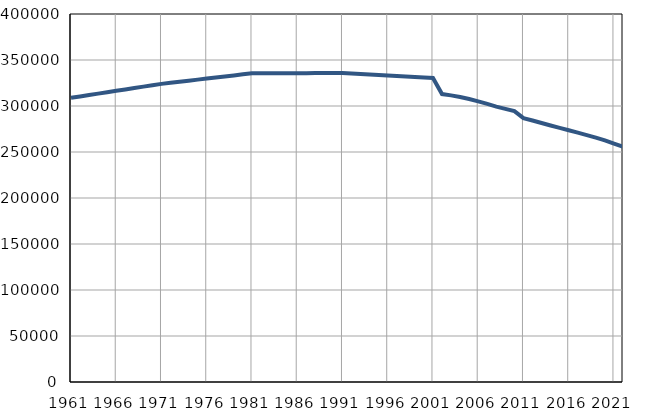
| Category | Број
становника |
|---|---|
| 1961.0 | 308918 |
| 1962.0 | 310433 |
| 1963.0 | 311947 |
| 1964.0 | 313462 |
| 1965.0 | 314977 |
| 1966.0 | 316492 |
| 1967.0 | 318006 |
| 1968.0 | 319521 |
| 1969.0 | 321036 |
| 1970.0 | 322550 |
| 1971.0 | 324065 |
| 1972.0 | 325216 |
| 1973.0 | 326366 |
| 1974.0 | 327517 |
| 1975.0 | 328667 |
| 1976.0 | 329818 |
| 1977.0 | 330968 |
| 1978.0 | 332119 |
| 1979.0 | 333269 |
| 1980.0 | 334420 |
| 1981.0 | 335570 |
| 1982.0 | 335596 |
| 1983.0 | 335621 |
| 1984.0 | 335647 |
| 1985.0 | 335672 |
| 1986.0 | 335698 |
| 1987.0 | 335724 |
| 1988.0 | 335749 |
| 1989.0 | 335775 |
| 1990.0 | 335800 |
| 1991.0 | 335826 |
| 1992.0 | 335295 |
| 1993.0 | 334764 |
| 1994.0 | 334233 |
| 1995.0 | 333702 |
| 1996.0 | 333171 |
| 1997.0 | 332641 |
| 1998.0 | 332110 |
| 1999.0 | 331579 |
| 2000.0 | 331048 |
| 2001.0 | 330517 |
| 2002.0 | 313000 |
| 2003.0 | 311572 |
| 2004.0 | 309856 |
| 2005.0 | 307622 |
| 2006.0 | 305072 |
| 2007.0 | 302228 |
| 2008.0 | 299360 |
| 2009.0 | 296858 |
| 2010.0 | 294400 |
| 2011.0 | 286825 |
| 2012.0 | 284216 |
| 2013.0 | 281475 |
| 2014.0 | 278771 |
| 2015.0 | 276210 |
| 2016.0 | 273629 |
| 2017.0 | 271080 |
| 2018.0 | 268393 |
| 2019.0 | 265638 |
| 2020.0 | 262664 |
| 2021.0 | 259182 |
| 2022.0 | 255623 |